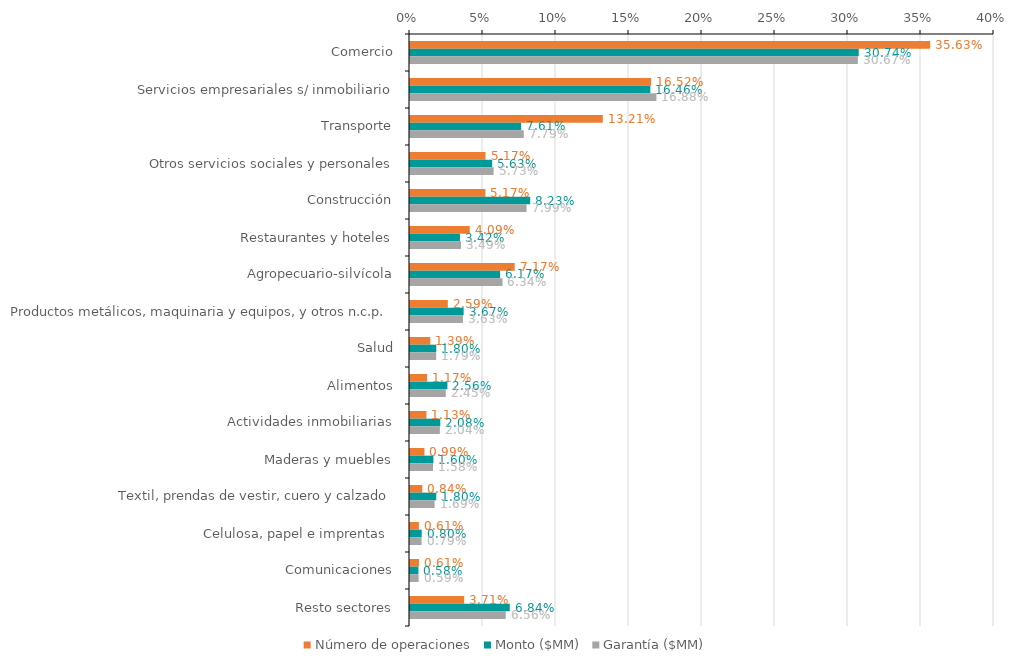
| Category | Número de operaciones | Monto ($MM) | Garantía ($MM) |
|---|---|---|---|
| Comercio | 0.356 | 0.307 | 0.307 |
| Servicios empresariales s/ inmobiliario | 0.165 | 0.165 | 0.169 |
| Transporte | 0.132 | 0.076 | 0.078 |
| Otros servicios sociales y personales | 0.052 | 0.056 | 0.057 |
| Construcción | 0.052 | 0.082 | 0.08 |
| Restaurantes y hoteles | 0.041 | 0.034 | 0.035 |
| Agropecuario-silvícola | 0.072 | 0.062 | 0.063 |
| Productos metálicos, maquinaria y equipos, y otros n.c.p. | 0.026 | 0.037 | 0.036 |
| Salud | 0.014 | 0.018 | 0.018 |
| Alimentos | 0.012 | 0.026 | 0.025 |
| Actividades inmobiliarias | 0.011 | 0.021 | 0.02 |
| Maderas y muebles | 0.01 | 0.016 | 0.016 |
| Textil, prendas de vestir, cuero y calzado | 0.008 | 0.018 | 0.017 |
| Celulosa, papel e imprentas  | 0.006 | 0.008 | 0.008 |
| Comunicaciones | 0.006 | 0.006 | 0.006 |
| Resto sectores | 0.037 | 0.068 | 0.066 |